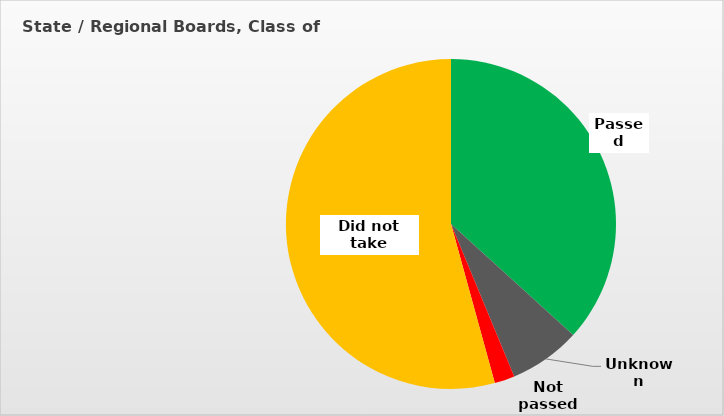
| Category | Series 0 |
|---|---|
| Passed | 0.367 |
| Unknown | 0.07 |
| Not passed | 0.02 |
| Did not take | 0.543 |